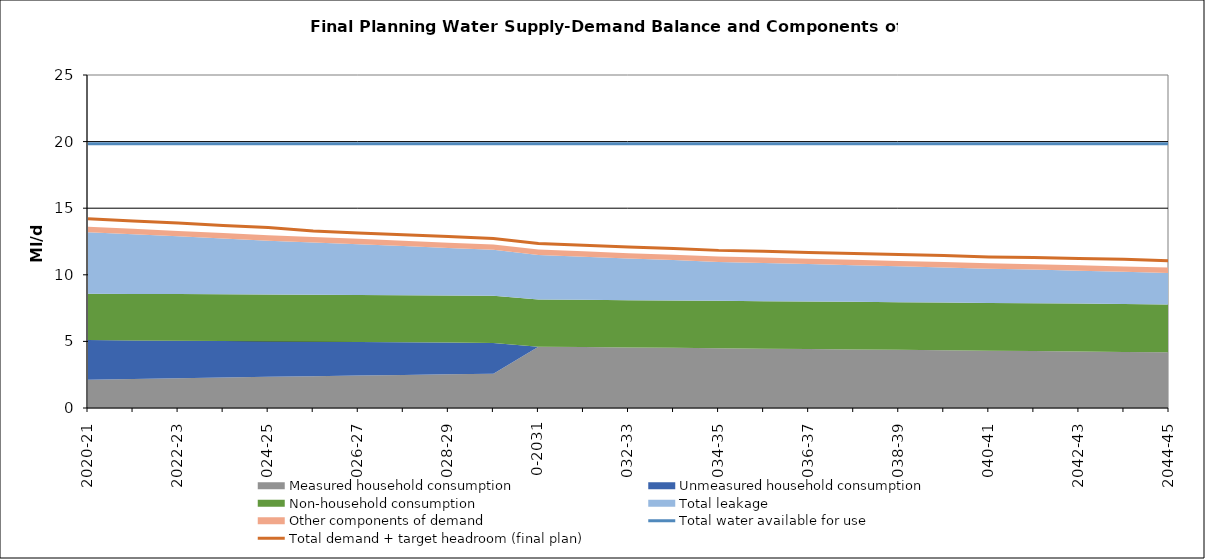
| Category | Total water available for use | Total demand + target headroom (final plan) |
|---|---|---|
| 0 | 19.84 | 14.202 |
| 1 | 19.84 | 14.036 |
| 2 | 19.84 | 13.882 |
| 3 | 19.84 | 13.71 |
| 4 | 19.84 | 13.544 |
| 5 | 19.84 | 13.297 |
| 6 | 19.84 | 13.138 |
| 7 | 19.84 | 13.013 |
| 8 | 19.84 | 12.867 |
| 9 | 19.84 | 12.726 |
| 10 | 19.84 | 12.345 |
| 11 | 19.84 | 12.222 |
| 12 | 19.84 | 12.08 |
| 13 | 19.84 | 11.981 |
| 14 | 19.84 | 11.834 |
| 15 | 19.84 | 11.763 |
| 16 | 19.84 | 11.675 |
| 17 | 19.84 | 11.604 |
| 18 | 19.84 | 11.526 |
| 19 | 19.84 | 11.45 |
| 20 | 19.84 | 11.345 |
| 21 | 19.84 | 11.29 |
| 22 | 19.84 | 11.222 |
| 23 | 19.84 | 11.159 |
| 24 | 19.84 | 11.058 |